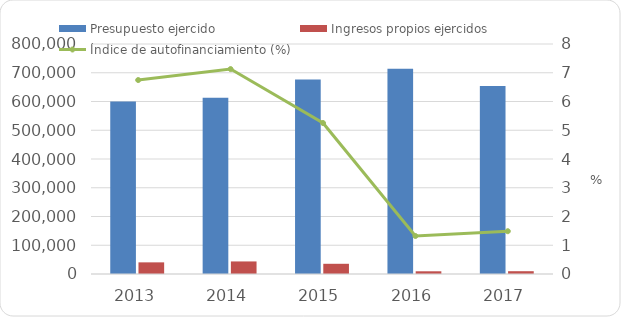
| Category | Presupuesto ejercido | Ingresos propios ejercidos  |
|---|---|---|
| 2013 | 600163.1 | 40487.2 |
| 2014 | 613052.1 | 43697.9 |
| 2015 | 676403.338 | 35517.936 |
| 2016 | 713725.8 | 9432.4 |
| 2017 | 653670.792 | 9727.901 |